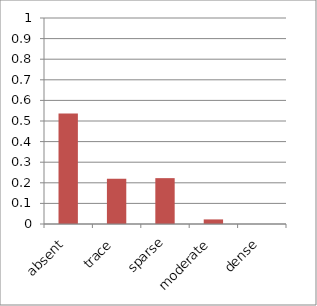
| Category | Ut gib |
|---|---|
| absent | 0.536 |
| trace | 0.219 |
| sparse | 0.223 |
| moderate | 0.022 |
| dense | 0 |